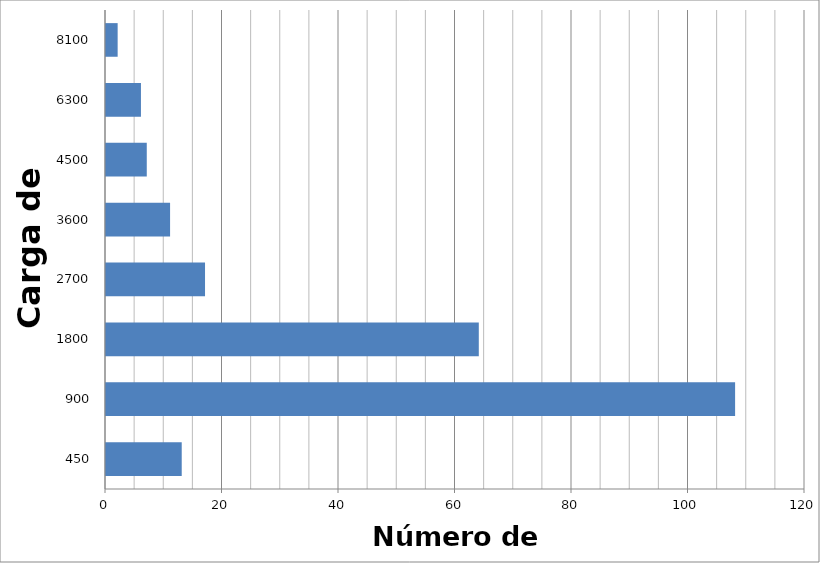
| Category | Series 0 |
|---|---|
| 450.0 | 13 |
| 900.0 | 108 |
| 1800.0 | 64 |
| 2700.0 | 17 |
| 3600.0 | 11 |
| 4500.0 | 7 |
| 6300.0 | 6 |
| 8100.0 | 2 |